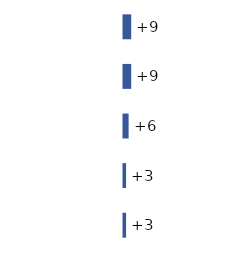
| Category | Series 0 |
|---|---|
| 0 | 9 |
| 1 | 9 |
| 2 | 6 |
| 3 | 3 |
| 4 | 3 |